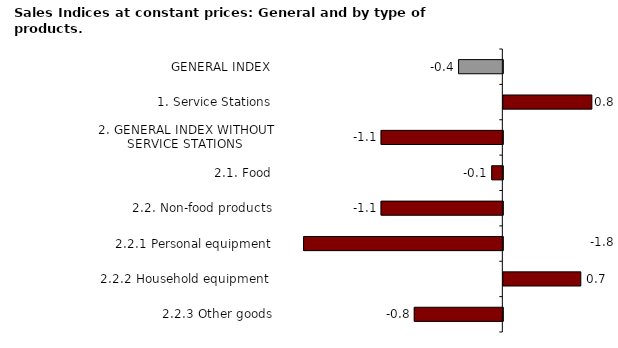
| Category | Seasonally adjusted |
|---|---|
| 2.2.3 Other goods | -0.8 |
| 2.2.2 Household equipment  | 0.7 |
| 2.2.1 Personal equipment | -1.8 |
| 2.2. Non-food products | -1.1 |
| 2.1. Food | -0.1 |
| 2. GENERAL INDEX WITHOUT SERVICE STATIONS | -1.1 |
| 1. Service Stations | 0.8 |
| GENERAL INDEX | -0.4 |